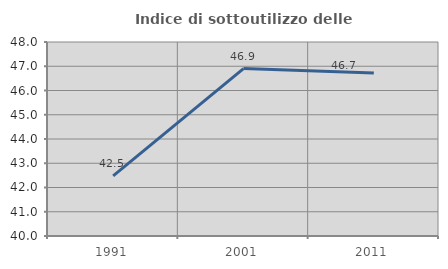
| Category | Indice di sottoutilizzo delle abitazioni  |
|---|---|
| 1991.0 | 42.483 |
| 2001.0 | 46.903 |
| 2011.0 | 46.722 |